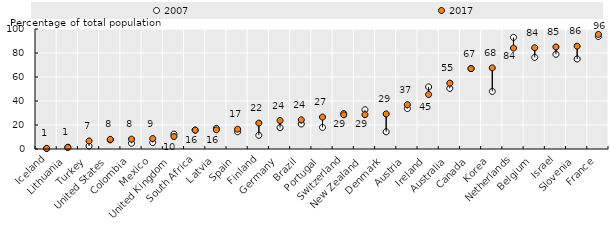
| Category | 2007 | 2017 |
|---|---|---|
| Iceland | 0.4 | 0.5 |
| Lithuania | 1.5 | 1.3 |
| Turkey | 2.5 | 6.7 |
| United States | 7.6 | 8 |
| Colombia | 4.8 | 8.2 |
| Mexico | 5.4 | 8.7 |
| United Kingdom | 12.4 | 10.4 |
| South Africa | 15.8 | 15.7 |
| Latvia | 17.2 | 16 |
| Spain | 14.4 | 16.5 |
| Finland | 11.4 | 21.6 |
| Germany | 17.8 | 23.7 |
| Brazil | 20.8 | 24.3 |
| Portugal | 18 | 26.6 |
| Switzerland | 29.5 | 28.5 |
| New Zealand | 32.7 | 28.6 |
| Denmark | 14.3 | 29.2 |
| Austria | 33.7 | 36.9 |
| Ireland | 51.7 | 45.4 |
| Australia | 50.5 | 54.9 |
| Canada | 67 | 67 |
| Korea | 48 | 67.6 |
| Netherlands | 93 | 84.1 |
| Belgium | 76.3 | 84.4 |
| Israel | 78.9 | 85 |
| Slovenia | 75 | 85.7 |
| France | 93.7 | 95.5 |